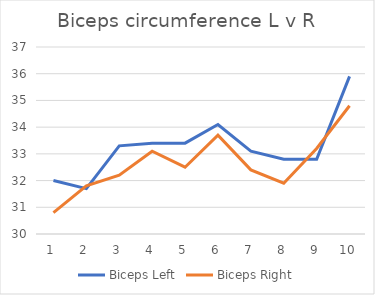
| Category | Biceps Left | Biceps Right |
|---|---|---|
| 0 | 32 | 30.8 |
| 1 | 31.7 | 31.8 |
| 2 | 33.3 | 32.2 |
| 3 | 33.4 | 33.1 |
| 4 | 33.4 | 32.5 |
| 5 | 34.1 | 33.7 |
| 6 | 33.1 | 32.4 |
| 7 | 32.8 | 31.9 |
| 8 | 32.8 | 33.2 |
| 9 | 35.9 | 34.8 |